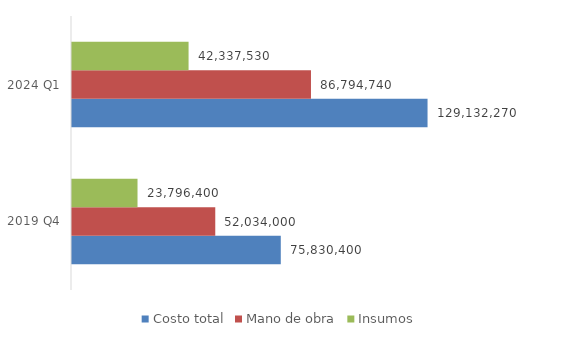
| Category | Costo total | Mano de obra | Insumos |
|---|---|---|---|
| 2019 Q4 | 75830400 | 52034000 | 23796400 |
| 2024 Q1 | 129132269.971 | 86794740 | 42337529.971 |